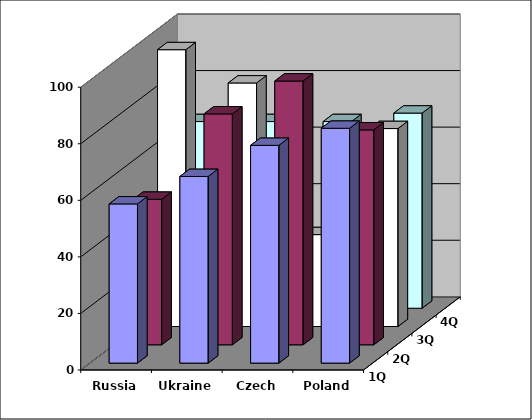
| Category | 1Q | 2Q | 3Q | 4Q |
|---|---|---|---|---|
| Russia | 56.294 | 51.473 | 97.882 | 66 |
| Ukraine | 66 | 81.657 | 86.124 | 66 |
| Czech | 77 | 93.281 | 32.496 | 66 |
| Poland | 83.039 | 76 | 70 | 69 |